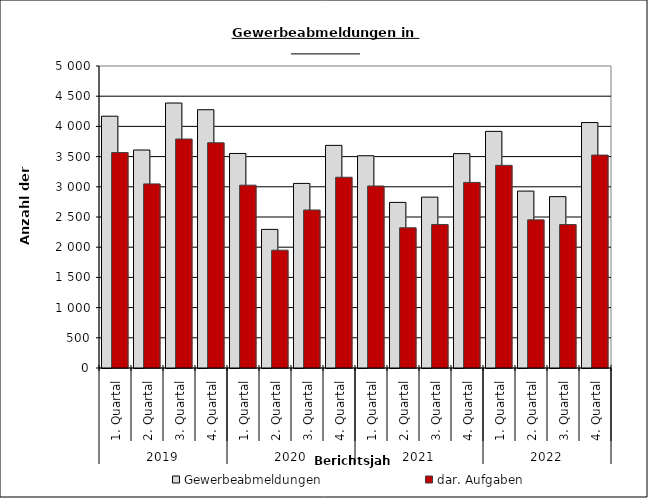
| Category | Gewerbeabmeldungen | dar. Aufgaben |
|---|---|---|
| 0 | 4169 | 3567 |
| 1 | 3609 | 3048 |
| 2 | 4387 | 3791 |
| 3 | 4276 | 3729 |
| 4 | 3552 | 3027 |
| 5 | 2295 | 1951 |
| 6 | 3056 | 2616 |
| 7 | 3686 | 3158 |
| 8 | 3514 | 3013 |
| 9 | 2742 | 2322 |
| 10 | 2829 | 2376 |
| 11 | 3549 | 3073 |
| 12 | 3918 | 3355 |
| 13 | 2929 | 2453 |
| 14 | 2837 | 2375 |
| 15 | 4064 | 3525 |